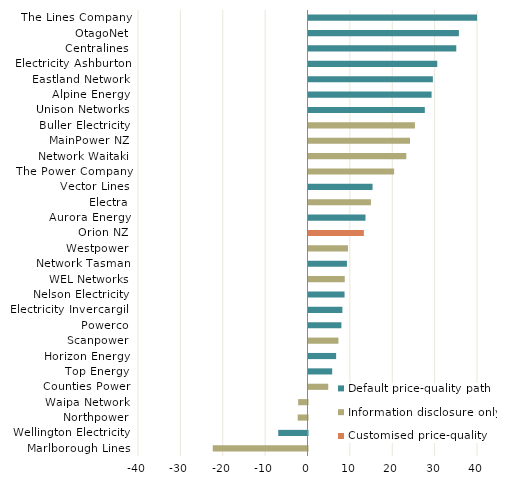
| Category | Default price-quality path | Information disclosure only | Customised price-quality path |
|---|---|---|---|
| The Lines Company | 39.78 | 0 | 0 |
| OtagoNet | 35.496 | 0 | 0 |
| Centralines | 34.873 | 0 | 0 |
| Electricity Ashburton | 30.388 | 0 | 0 |
| Eastland Network | 29.348 | 0 | 0 |
| Alpine Energy | 29.046 | 0 | 0 |
| Unison Networks | 27.453 | 0 | 0 |
| Buller Electricity | 0 | 25.116 | 0 |
| MainPower NZ | 0 | 23.95 | 0 |
| Network Waitaki | 0 | 23.083 | 0 |
| The Power Company | 0 | 20.203 | 0 |
| Vector Lines | 15.116 | 0 | 0 |
| Electra | 0 | 14.737 | 0 |
| Aurora Energy | 13.448 | 0 | 0 |
| Orion NZ | 0 | 0 | 13.065 |
| Westpower | 0 | 9.316 | 0 |
| Network Tasman | 9.068 | 0 | 0 |
| WEL Networks | 0 | 8.552 | 0 |
| Nelson Electricity | 8.511 | 0 | 0 |
| Electricity Invercargill | 7.995 | 0 | 0 |
| Powerco | 7.76 | 0 | 0 |
| Scanpower | 0 | 7.065 | 0 |
| Horizon Energy | 6.523 | 0 | 0 |
| Top Energy | 5.59 | 0 | 0 |
| Counties Power | 0 | 4.659 | 0 |
| Waipa Network | 0 | -2.203 | 0 |
| Northpower | 0 | -2.315 | 0 |
| Wellington Electricity | -6.908 | 0 | 0 |
| Marlborough Lines | 0 | -22.359 | 0 |